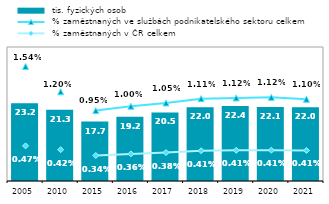
| Category |  tis. fyzických osob |
|---|---|
| 2005.0 | 23.2 |
| 2010.0 | 21.261 |
| 2015.0 | 17.733 |
| 2016.0 | 19.175 |
| 2017.0 | 20.459 |
| 2018.0 | 22.009 |
| 2019.0 | 22.374 |
| 2020.0 | 22.08 |
| 2021.0 | 21.993 |